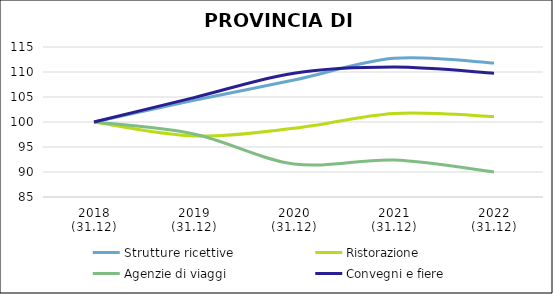
| Category | Strutture ricettive | Ristorazione | Agenzie di viaggi | Convegni e fiere |
|---|---|---|---|---|
| 2018
(31.12) | 100 | 100 | 100 | 100 |
| 2019
(31.12) | 104.348 | 97.214 | 97.6 | 104.878 |
| 2020
(31.12) | 108.385 | 98.741 | 91.6 | 109.756 |
| 2021
(31.12) | 112.733 | 101.717 | 92.4 | 110.976 |
| 2022
(31.12) | 111.801 | 101.107 | 90 | 109.756 |